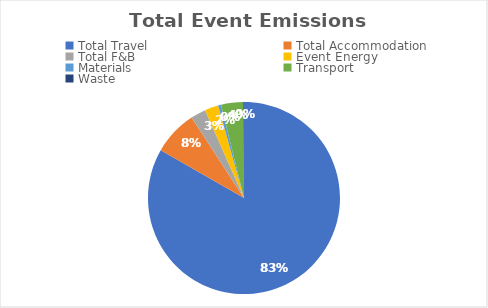
| Category | Series 0 |
|---|---|
| Total Travel | 13.41 |
| Total Accommodation | 1.21 |
| Total F&B | 0.41 |
| Event Energy | 0.37 |
| Materials | 0.08 |
| Transport | 0.6 |
| Waste | 0.02 |